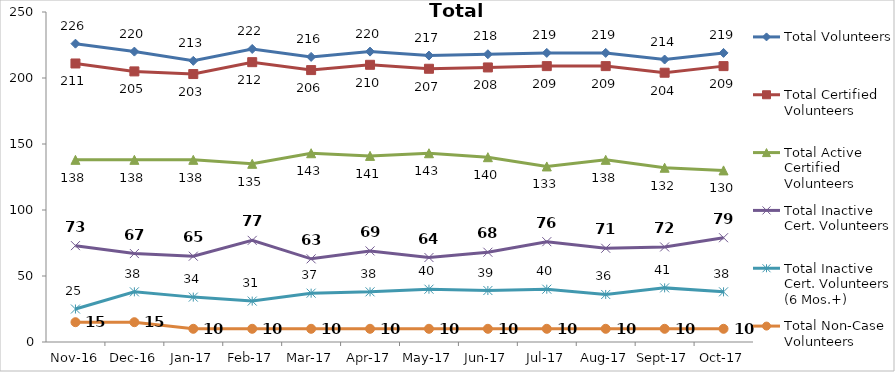
| Category | Total Volunteers | Total Certified Volunteers | Total Active Certified Volunteers | Total Inactive Cert. Volunteers | Total Inactive Cert. Volunteers (6 Mos.+) | Total Non-Case Volunteers |
|---|---|---|---|---|---|---|
| 2016-11-01 | 226 | 211 | 138 | 73 | 25 | 15 |
| 2016-12-01 | 220 | 205 | 138 | 67 | 38 | 15 |
| 2017-01-01 | 213 | 203 | 138 | 65 | 34 | 10 |
| 2017-02-01 | 222 | 212 | 135 | 77 | 31 | 10 |
| 2017-03-01 | 216 | 206 | 143 | 63 | 37 | 10 |
| 2017-04-01 | 220 | 210 | 141 | 69 | 38 | 10 |
| 2017-05-01 | 217 | 207 | 143 | 64 | 40 | 10 |
| 2017-06-01 | 218 | 208 | 140 | 68 | 39 | 10 |
| 2017-07-01 | 219 | 209 | 133 | 76 | 40 | 10 |
| 2017-08-01 | 219 | 209 | 138 | 71 | 36 | 10 |
| 2017-09-01 | 214 | 204 | 132 | 72 | 41 | 10 |
| 2017-10-01 | 219 | 209 | 130 | 79 | 38 | 10 |